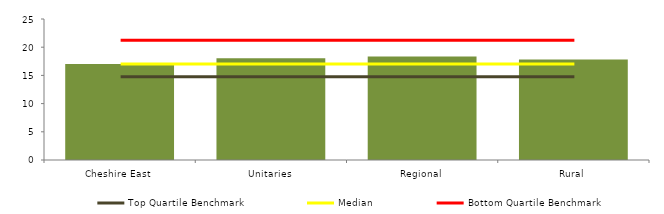
| Category | Block Data |
|---|---|
| Cheshire East | 17 |
| Unitaries | 18.054 |
| Regional | 18.333 |
|  Rural  | 17.8 |